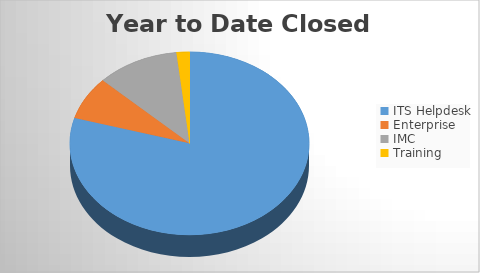
| Category | YTD Closed Tickets | 6M Opened |
|---|---|---|
| ITS Helpdesk | 1355 | 1418 |
| Enterprise | 130 | 148 |
| IMC | 190 | 206 |
| Training | 30 | 46 |